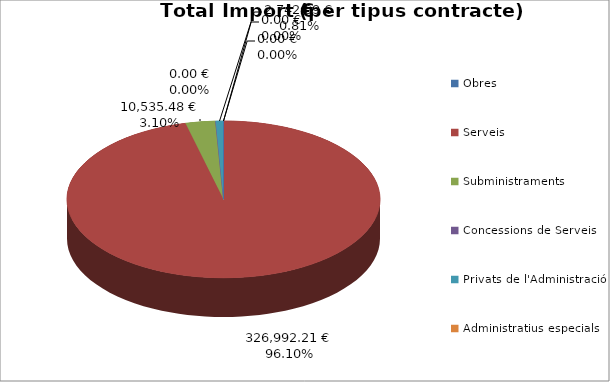
| Category | Total preu              (amb iva) |
|---|---|
| Obres | 0 |
| Serveis | 326992.21 |
| Subministraments | 10535.48 |
| Concessions de Serveis | 0 |
| Privats de l'Administració | 2742.69 |
| Administratius especials | 0 |